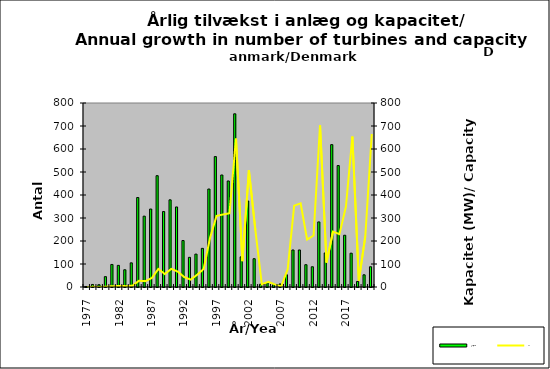
| Category | Antal/No |
|---|---|
| 1977.0 | 2 |
| 1978.0 | 11 |
| 1979.0 | 10 |
| 1980.0 | 45 |
| 1981.0 | 98 |
| 1982.0 | 94 |
| 1983.0 | 75 |
| 1984.0 | 105 |
| 1985.0 | 389 |
| 1986.0 | 308 |
| 1987.0 | 339 |
| 1988.0 | 484 |
| 1989.0 | 328 |
| 1990.0 | 379 |
| 1991.0 | 348 |
| 1992.0 | 202 |
| 1993.0 | 129 |
| 1994.0 | 143 |
| 1995.0 | 168 |
| 1996.0 | 426 |
| 1997.0 | 567 |
| 1998.0 | 487 |
| 1999.0 | 461 |
| 2000.0 | 753 |
| 2001.0 | 131 |
| 2002.0 | 374 |
| 2003.0 | 123 |
| 2004.0 | 12 |
| 2005.0 | 18 |
| 2006.0 | 10 |
| 2007.0 | 13 |
| 2008.0 | 53 |
| 2009.0 | 161 |
| 2010.0 | 161 |
| 2011.0 | 97 |
| 2012.0 | 88 |
| 2013.0 | 283 |
| 2014.0 | 148 |
| 2015.0 | 619 |
| 2016.0 | 528 |
| 2017.0 | 225 |
| 2018.0 | 147 |
| 2019.0 | 24 |
| 2020.0 | 53 |
| 2021.0 | 88 |